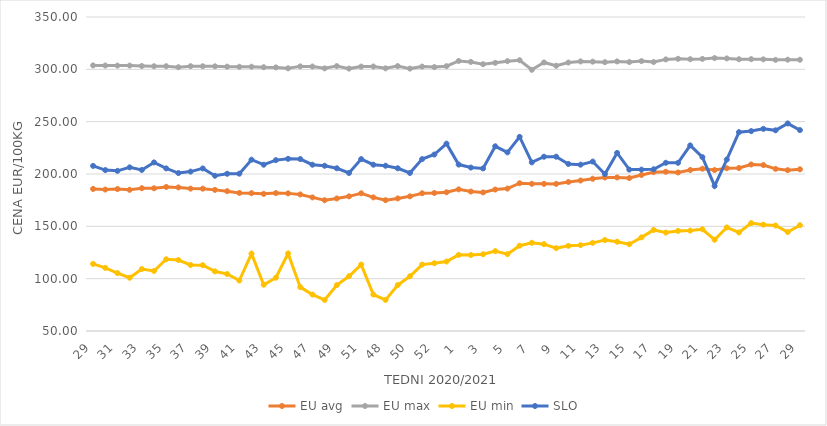
| Category | EU avg | EU max | EU min | SLO |
|---|---|---|---|---|
| 29.0 | 185.712 | 303.73 | 114.082 | 207.73 |
| 30.0 | 185.141 | 303.63 | 110.314 | 203.73 |
| 31.0 | 185.621 | 303.57 | 105.336 | 203 |
| 32.0 | 184.887 | 303.58 | 100.908 | 206.36 |
| 33.0 | 186.411 | 303.17 | 109.191 | 203.88 |
| 34.0 | 186.338 | 302.96 | 107.355 | 211.07 |
| 35.0 | 187.628 | 302.99 | 118.534 | 205.34 |
| 36.0 | 187.19 | 302.05 | 117.814 | 200.88 |
| 37.0 | 186.038 | 302.98 | 113.058 | 202.29 |
| 38.0 | 185.986 | 302.94 | 112.896 | 205.33 |
| 39.0 | 184.836 | 302.88 | 106.953 | 198.33 |
| 40.0 | 183.595 | 302.56 | 104.426 | 200.21 |
| 41.0 | 181.893 | 302.44 | 98.23 | 200.3 |
| 42.0 | 181.671 | 302.52 | 123.908 | 213.66 |
| 43.0 | 181.023 | 302.01 | 94.177 | 208.86 |
| 44.0 | 181.795 | 301.86 | 100.908 | 213.25 |
| 45.0 | 181.489 | 300.98 | 124 | 214.51 |
| 46.0 | 180.473 | 302.82 | 91.889 | 214.27 |
| 47.0 | 177.656 | 302.7 | 84.832 | 208.87 |
| 48.0 | 174.977 | 300.94 | 79.697 | 207.9 |
| 49.0 | 176.65 | 303.09 | 93.873 | 205.48 |
| 50.0 | 178.648 | 300.7 | 102.316 | 200.99 |
| 51.0 | 181.58 | 302.62 | 113.46 | 214.25 |
| 47.0 | 177.656 | 302.7 | 84.832 | 208.87 |
| 48.0 | 174.977 | 300.94 | 79.697 | 207.9 |
| 49.0 | 176.65 | 303.09 | 93.873 | 205.48 |
| 50.0 | 178.648 | 300.7 | 102.316 | 200.99 |
| 51.0 | 181.58 | 302.62 | 113.46 | 214.25 |
| 52.0 | 181.9 | 302.14 | 114.76 | 218.61 |
| 53.0 | 182.536 | 303 | 116.375 | 229 |
| 1.0 | 185.3 | 308 | 122.769 | 209 |
| 2.0 | 183.25 | 307.1 | 122.609 | 206.15 |
| 3.0 | 182.393 | 304.91 | 123.32 | 205.35 |
| 4.0 | 185.158 | 306.22 | 126.329 | 226.48 |
| 5.0 | 186.04 | 307.79 | 123.461 | 220.65 |
| 6.0 | 191.206 | 308.7 | 131.528 | 235.46 |
| 7.0 | 190.629 | 299.55 | 134.262 | 211.1 |
| 8.0 | 190.57 | 306.55 | 132.97 | 216.51 |
| 9.0 | 190.562 | 303.4 | 129.173 | 216.54 |
| 10.0 | 192.373 | 306.48 | 131.374 | 209.61 |
| 11.0 | 193.79 | 307.58 | 132.024 | 208.91 |
| 12.0 | 195.449 | 307.33 | 134.212 | 211.87 |
| 13.0 | 196.631 | 306.85 | 136.936 | 199.93 |
| 14.0 | 196.702 | 307.56 | 135.297 | 220.15 |
| 15.0 | 196.13 | 306.96 | 132.893 | 204.2 |
| 16.0 | 199.1 | 307.87 | 139.462 | 204.2 |
| 17.0 | 201.754 | 306.98 | 146.538 | 204.51 |
| 18.0 | 202.13 | 309.49 | 144.017 | 210.72 |
| 19.0 | 201.439 | 310.06 | 145.644 | 210.68 |
| 20.0 | 203.834 | 309.69 | 145.911 | 227.32 |
| 21.0 | 205.04 | 309.99 | 147.188 | 216.08 |
| 22.0 | 203.79 | 310.76 | 137.177 | 188.6 |
| 23.0 | 205.51 | 310.41 | 148.928 | 213.84 |
| 24.0 | 205.73 | 309.64 | 144.161 | 239.99 |
| 25.0 | 209.095 | 309.74 | 153.081 | 240.99 |
| 26.0 | 208.551 | 309.55 | 151.599 | 243.11 |
| 27.0 | 204.914 | 309.08 | 150.789 | 241.72 |
| 28.0 | 203.681 | 309.21 | 144.56 | 248.33 |
| 29.0 | 204.503 | 309.15 | 151.052 | 241.96 |